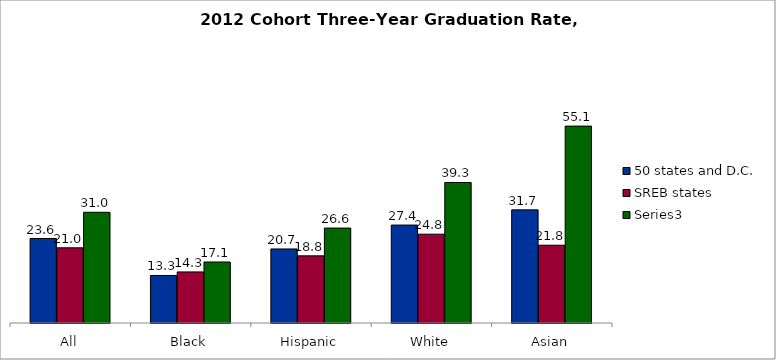
| Category | 50 states and D.C. | SREB states | Series 2 |
|---|---|---|---|
| All | 23.632 | 21.029 | 30.969 |
| Black | 13.298 | 14.29 | 17.063 |
| Hispanic | 20.716 | 18.782 | 26.553 |
| White | 27.394 | 24.844 | 39.309 |
| Asian | 31.651 | 21.759 | 55.072 |